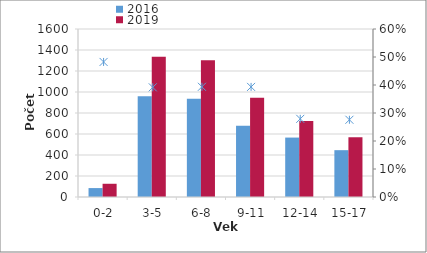
| Category | 2016 | 2019 |
|---|---|---|
|  0-2 | 85 | 126 |
|  3-5 | 960 | 1336 |
|  6-8 | 935 | 1303 |
|  9-11 | 679 | 946 |
|  12-14 | 566 | 724 |
|  15-17 | 446 | 569 |